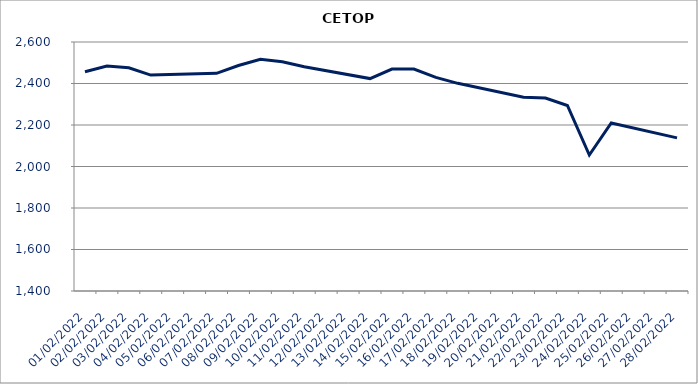
| Category | CETOP |
|---|---|
| 01/02/2022 | 2456.58 |
| 02/02/2022 | 2483.85 |
| 03/02/2022 | 2475.55 |
| 04/02/2022 | 2440.52 |
| 07/02/2022 | 2449.13 |
| 08/02/2022 | 2486.6 |
| 09/02/2022 | 2516.89 |
| 10/02/2022 | 2505.07 |
| 11/02/2022 | 2480.33 |
| 14/02/2022 | 2423.76 |
| 15/02/2022 | 2469.83 |
| 16/02/2022 | 2469.57 |
| 17/02/2022 | 2429.57 |
| 18/02/2022 | 2400.81 |
| 21/02/2022 | 2333.46 |
| 22/02/2022 | 2330.07 |
| 23/02/2022 | 2294.16 |
| 24/02/2022 | 2055.3 |
| 25/02/2022 | 2209.58 |
| 28/02/2022 | 2137.93 |